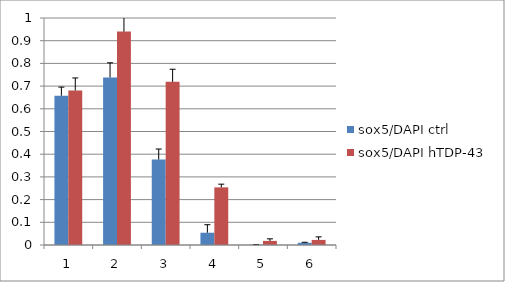
| Category | sox5/DAPI ctrl | sox5/DAPI hTDP-43 |
|---|---|---|
| 0 | 0.658 | 0.681 |
| 1 | 0.738 | 0.94 |
| 2 | 0.377 | 0.719 |
| 3 | 0.054 | 0.254 |
| 4 | 0.001 | 0.018 |
| 5 | 0.01 | 0.022 |